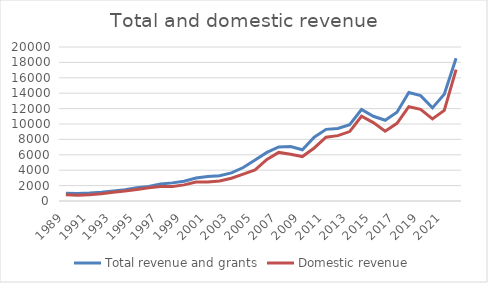
| Category | Total revenue and grants | Domestic revenue |
|---|---|---|
| 1989.0 | 1013.9 | 824.2 |
| 1990.0 | 988.9 | 749.7 |
| 1991.0 | 1026.2 | 811.4 |
| 1992.0 | 1125.5 | 929.2 |
| 1993.0 | 1308.7 | 1127.1 |
| 1994.0 | 1451.7 | 1286.9 |
| 1995.0 | 1721.6 | 1484.9 |
| 1996.0 | 1897.7 | 1727.6 |
| 1997.0 | 2201.8 | 1889.8 |
| 1998.0 | 2352.9 | 1882.6 |
| 1999.0 | 2569 | 2091.9 |
| 2000.0 | 2975.8 | 2459.4 |
| 2001.0 | 3184.8 | 2465.8 |
| 2002.0 | 3286.4 | 2595 |
| 2003.0 | 3650.1 | 2957.1 |
| 2004.0 | 4349.6 | 3499.9 |
| 2005.0 | 5326.8 | 4043.7 |
| 2006.0 | 6311.6 | 5397 |
| 2007.0 | 7028.6 | 6307.6 |
| 2008.0 | 7073.3 | 6071.3 |
| 2009.0 | 6651.3 | 5773.8 |
| 2010.0 | 8278.9 | 6887.8 |
| 2011.0 | 9304.9 | 8279.9 |
| 2012.0 | 9418.9 | 8488.1 |
| 2013.0 | 9897.5 | 9020 |
| 2014.0 | 11874.9 | 11007.4 |
| 2015.0 | 11003.1 | 10183.6 |
| 2016.0 | 10485.5 | 9055.4 |
| 2017.0 | 11525.1 | 10085.2 |
| 2018.0 | 14085.1 | 12249.4 |
| 2019.0 | 13680.5 | 11904.9 |
| 2020.0 | 12093.3 | 10668.3 |
| 2021.0 | 13860.4 | 11772.4 |
| 2022.0 | 18538.2 | 17066.1 |